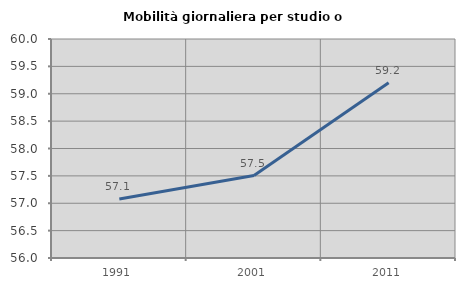
| Category | Mobilità giornaliera per studio o lavoro |
|---|---|
| 1991.0 | 57.078 |
| 2001.0 | 57.507 |
| 2011.0 | 59.201 |